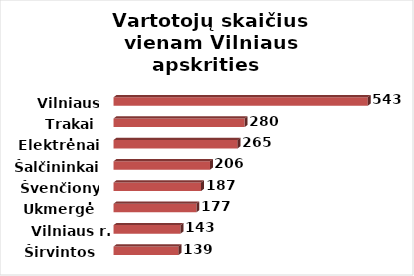
| Category | Series 0 |
|---|---|
| Širvintos | 139 |
| Vilniaus r. | 143 |
| Ukmergė | 177 |
| Švenčionys | 187 |
| Šalčininkai | 206 |
| Elektrėnai | 265 |
| Trakai | 280 |
| Vilniaus m. | 543 |